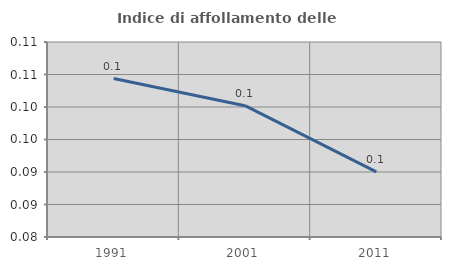
| Category | Indice di affollamento delle abitazioni  |
|---|---|
| 1991.0 | 0.104 |
| 2001.0 | 0.1 |
| 2011.0 | 0.09 |